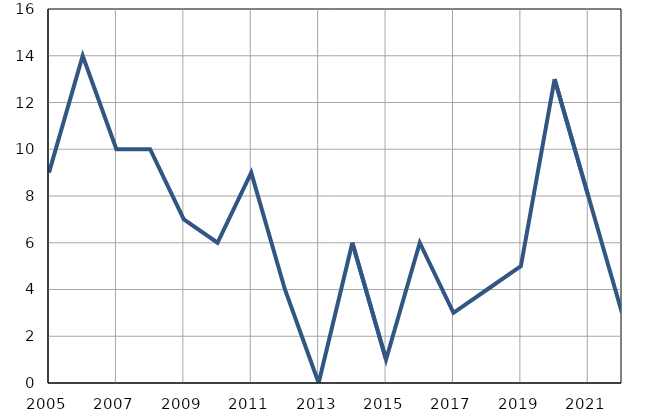
| Category | Умрла 
одојчад |
|---|---|
| 2005.0 | 9 |
| 2006.0 | 14 |
| 2007.0 | 10 |
| 2008.0 | 10 |
| 2009.0 | 7 |
| 2010.0 | 6 |
| 2011.0 | 9 |
| 2012.0 | 4 |
| 2013.0 | 0 |
| 2014.0 | 6 |
| 2015.0 | 1 |
| 2016.0 | 6 |
| 2017.0 | 3 |
| 2018.0 | 4 |
| 2019.0 | 5 |
| 2020.0 | 13 |
| 2021.0 | 8 |
| 2022.0 | 3 |